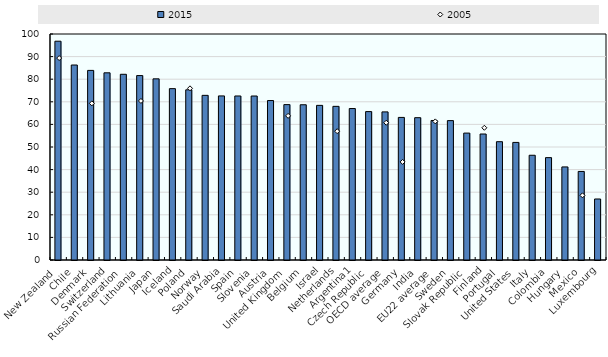
| Category | 2015 |
|---|---|
| New Zealand | 96.808 |
| Chile | 86.277 |
| Denmark | 83.892 |
| Switzerland | 82.82 |
| Russian Federation | 82.174 |
| Lithuania | 81.609 |
| Japan | 80.157 |
| Iceland | 75.828 |
| Poland | 75.3 |
| Norway | 72.851 |
| Saudi Arabia | 72.601 |
| Spain | 72.574 |
| Slovenia | 72.566 |
| Austria | 70.559 |
| United Kingdom | 68.755 |
| Belgium | 68.694 |
| Israel | 68.425 |
| Netherlands | 67.989 |
| Argentina1 | 67.02 |
| Czech Republic | 65.665 |
| OECD average | 65.535 |
| Germany | 63.094 |
| India | 62.976 |
| EU22 average | 61.737 |
| Sweden | 61.675 |
| Slovak Republic | 56.156 |
| Finland | 55.746 |
| Portugal | 52.345 |
| United States | 52.027 |
| Italy | 46.349 |
| Colombia | 45.297 |
| Hungary | 41.181 |
| Mexico | 39.186 |
| Luxembourg | 26.994 |